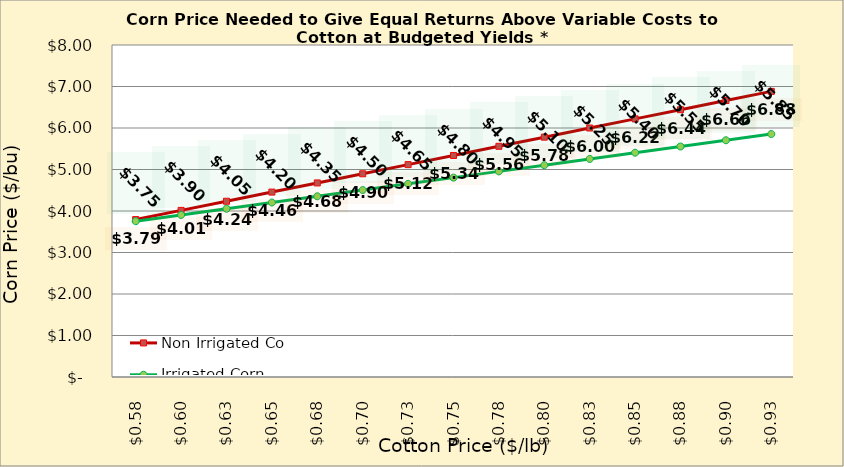
| Category | Non Irrigated Corn | Irrigated Corn |
|---|---|---|
| 0.5749999999999998 | 3.794 | 3.754 |
| 0.5999999999999999 | 4.015 | 3.904 |
| 0.6249999999999999 | 4.235 | 4.054 |
| 0.6499999999999999 | 4.456 | 4.204 |
| 0.6749999999999999 | 4.676 | 4.354 |
| 0.7 | 4.897 | 4.504 |
| 0.725 | 5.117 | 4.654 |
| 0.75 | 5.338 | 4.804 |
| 0.775 | 5.559 | 4.954 |
| 0.8 | 5.779 | 5.104 |
| 0.8250000000000001 | 6 | 5.254 |
| 0.8500000000000001 | 6.22 | 5.404 |
| 0.8750000000000001 | 6.441 | 5.554 |
| 0.9000000000000001 | 6.662 | 5.704 |
| 0.9250000000000002 | 6.882 | 5.854 |